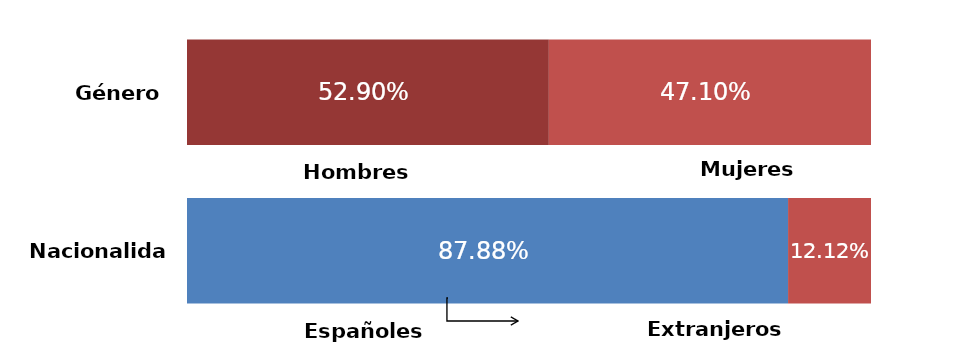
| Category | Series 0 | Series 1 |
|---|---|---|
| 0 | 0.529 | 0.471 |
| 1 | 0.879 | 0.121 |